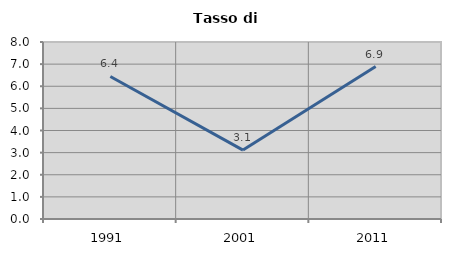
| Category | Tasso di disoccupazione   |
|---|---|
| 1991.0 | 6.443 |
| 2001.0 | 3.115 |
| 2011.0 | 6.891 |